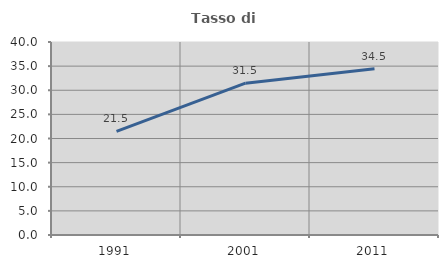
| Category | Tasso di occupazione   |
|---|---|
| 1991.0 | 21.47 |
| 2001.0 | 31.458 |
| 2011.0 | 34.478 |